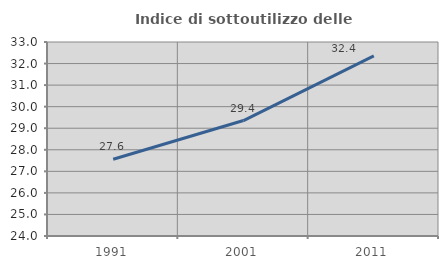
| Category | Indice di sottoutilizzo delle abitazioni  |
|---|---|
| 1991.0 | 27.558 |
| 2001.0 | 29.356 |
| 2011.0 | 32.359 |